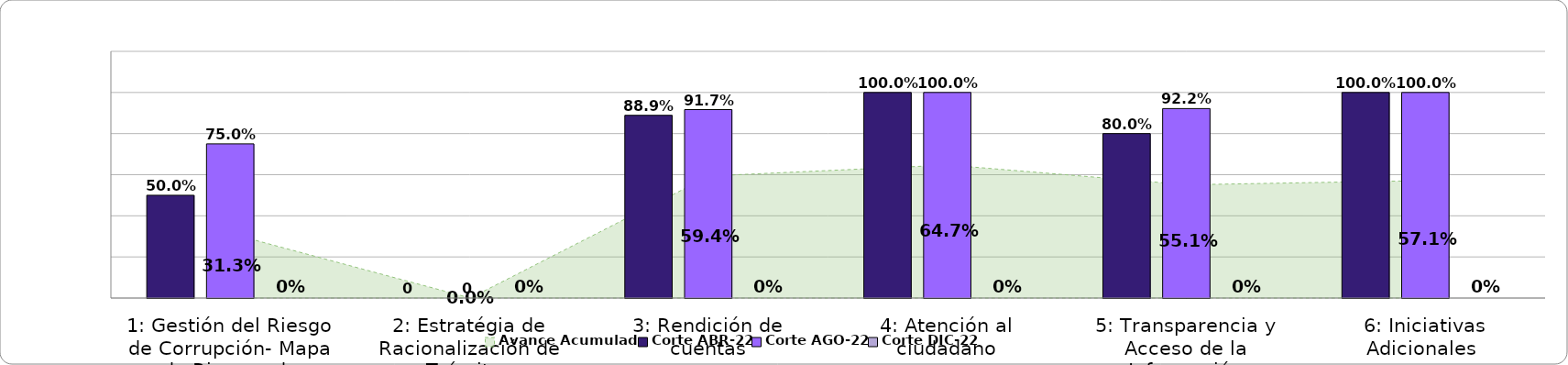
| Category | Corte ABR-22 | Corte AGO-22 | Corte DIC-22 |
|---|---|---|---|
| 1: Gestión del Riesgo de Corrupción- Mapa de Riesgos de Corrupción | 0.5 | 0.75 | 0 |
| 2: Estratégia de Racionalización de Trámites | 0 | 0 | 0 |
| 3: Rendición de cuentas | 0.889 | 0.917 | 0 |
| 4: Atención al ciudadano | 1 | 1 | 0 |
| 5: Transparencia y Acceso de la Información | 0.8 | 0.922 | 0 |
| 6: Iniciativas Adicionales  | 1 | 1 | 0 |